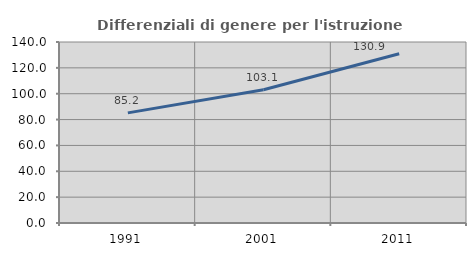
| Category | Differenziali di genere per l'istruzione superiore |
|---|---|
| 1991.0 | 85.177 |
| 2001.0 | 103.061 |
| 2011.0 | 130.894 |